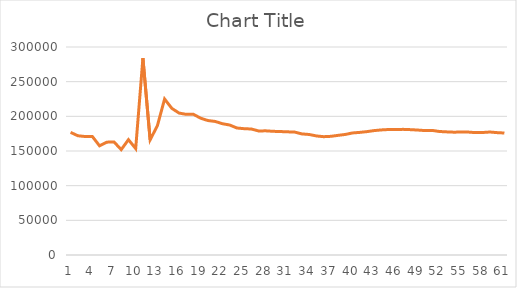
| Category | Series 0 |
|---|---|
| 0 | 176859 |
| 1 | 171986 |
| 2 | 170884 |
| 3 | 170993 |
| 4 | 157505 |
| 5 | 162739 |
| 6 | 163124 |
| 7 | 151981 |
| 8 | 166348 |
| 9 | 153501 |
| 10 | 283846 |
| 11 | 166185 |
| 12 | 186396 |
| 13 | 224970 |
| 14 | 211497 |
| 15 | 204733 |
| 16 | 202846 |
| 17 | 202847 |
| 18 | 197253 |
| 19 | 193907 |
| 20 | 192630 |
| 21 | 189343 |
| 22 | 187481 |
| 23 | 183182 |
| 24 | 182183 |
| 25 | 181730 |
| 26 | 178909 |
| 27 | 179079 |
| 28 | 178393 |
| 29 | 178061 |
| 30 | 177656 |
| 31 | 177257 |
| 32 | 174638 |
| 33 | 173805 |
| 34 | 171710 |
| 35 | 170654 |
| 36 | 171156 |
| 37 | 172582 |
| 38 | 173889 |
| 39 | 176037 |
| 40 | 176859 |
| 41 | 177964 |
| 42 | 179455 |
| 43 | 180407 |
| 44 | 181004 |
| 45 | 180974 |
| 46 | 181213 |
| 47 | 180805 |
| 48 | 180222 |
| 49 | 179488 |
| 50 | 179733 |
| 51 | 178139 |
| 52 | 177596 |
| 53 | 177163 |
| 54 | 177321 |
| 55 | 177307 |
| 56 | 176499 |
| 57 | 176676 |
| 58 | 177382 |
| 59 | 176490 |
| 60 | 175940 |